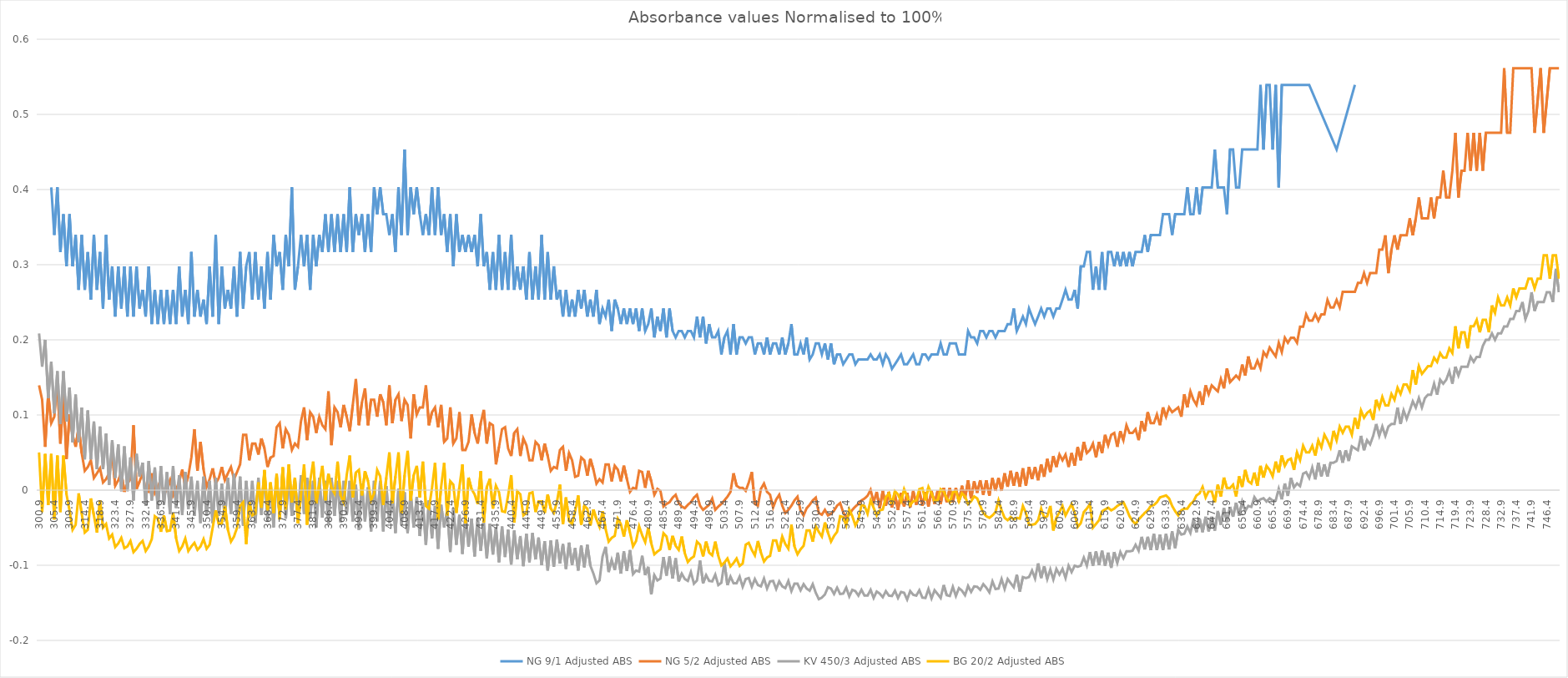
| Category | NG 9/1 | NG 5/2 | KV 450/3 | BG 20/2 |
|---|---|---|---|---|
| 300.90000000001135 | 0 | 0.139 | 0.209 | 0.05 |
| 301.8000000000113 | 0 | 0.12 | 0.164 | -0.029 |
| 302.7000000000113 | 0 | 0.058 | 0.2 | 0.048 |
| 303.6000000000113 | 0 | 0.128 | 0.123 | -0.02 |
| 304.50000000001125 | 0.403 | 0.089 | 0.171 | 0.048 |
| 305.40000000001123 | 0.34 | 0.098 | 0.102 | -0.039 |
| 306.3000000000112 | 0.403 | 0.144 | 0.158 | 0.046 |
| 307.2000000000112 | 0.317 | 0.062 | 0.088 | -0.029 |
| 308.10000000001116 | 0.367 | 0.128 | 0.158 | 0.046 |
| 309.00000000001114 | 0.298 | 0.042 | 0.091 | -0.006 |
| 309.9000000000111 | 0.367 | 0.101 | 0.137 | -0.027 |
| 310.8000000000111 | 0.298 | 0.074 | 0.064 | -0.053 |
| 311.7000000000111 | 0.34 | 0.058 | 0.127 | -0.046 |
| 312.60000000001105 | 0.267 | 0.084 | 0.064 | -0.004 |
| 313.500000000011 | 0.34 | 0.049 | 0.11 | -0.031 |
| 314.400000000011 | 0.267 | 0.026 | 0.041 | -0.056 |
| 315.300000000011 | 0.317 | 0.031 | 0.106 | -0.053 |
| 316.20000000001096 | 0.254 | 0.04 | 0.041 | -0.011 |
| 317.10000000001094 | 0.34 | 0.016 | 0.091 | -0.034 |
| 318.0000000000109 | 0.267 | 0.022 | 0.028 | -0.056 |
| 318.9000000000109 | 0.317 | 0.029 | 0.085 | -0.014 |
| 319.80000000001087 | 0.242 | 0.01 | 0.028 | -0.05 |
| 320.70000000001085 | 0.34 | 0.015 | 0.075 | -0.045 |
| 321.6000000000108 | 0.254 | 0.022 | 0.007 | -0.064 |
| 322.5000000000108 | 0.298 | 0.049 | 0.066 | -0.059 |
| 323.4000000000108 | 0.231 | 0.006 | 0.016 | -0.076 |
| 324.30000000001075 | 0.298 | 0.013 | 0.061 | -0.071 |
| 325.20000000001073 | 0.242 | 0.024 | -0.001 | -0.063 |
| 326.1000000000107 | 0.298 | -0.002 | 0.058 | -0.077 |
| 327.0000000000107 | 0.231 | 0.009 | -0.001 | -0.075 |
| 327.90000000001066 | 0.298 | 0.015 | 0.043 | -0.068 |
| 328.80000000001064 | 0.231 | 0.086 | -0.014 | -0.082 |
| 329.7000000000106 | 0.298 | 0.002 | 0.048 | -0.078 |
| 330.6000000000106 | 0.242 | 0.012 | 0.018 | -0.072 |
| 331.5000000000106 | 0.267 | 0.022 | 0.037 | -0.068 |
| 332.40000000001055 | 0.231 | -0.001 | -0.021 | -0.081 |
| 333.3000000000105 | 0.298 | -0.002 | 0.039 | -0.075 |
| 334.2000000000105 | 0.221 | 0.022 | -0.014 | -0.065 |
| 335.1000000000105 | 0.267 | -0.004 | 0.03 | -0.035 |
| 336.00000000001046 | 0.221 | 0.004 | -0.025 | -0.038 |
| 336.90000000001044 | 0.267 | 0.015 | 0.032 | -0.056 |
| 337.8000000000104 | 0.221 | -0.006 | -0.02 | -0.034 |
| 338.7000000000104 | 0.267 | 0.002 | 0.024 | -0.055 |
| 339.60000000001037 | 0.221 | 0.013 | -0.032 | -0.054 |
| 340.50000000001035 | 0.267 | -0.007 | 0.032 | -0.03 |
| 341.4000000000103 | 0.221 | 0 | -0.024 | -0.064 |
| 342.3000000000103 | 0.298 | 0.012 | 0.02 | -0.081 |
| 343.2000000000103 | 0.231 | 0.027 | -0.033 | -0.075 |
| 344.10000000001025 | 0.267 | 0.004 | 0.024 | -0.064 |
| 345.00000000001023 | 0.221 | 0.019 | -0.025 | -0.081 |
| 345.9000000000102 | 0.317 | 0.043 | 0.018 | -0.075 |
| 346.8000000000102 | 0.231 | 0.081 | -0.034 | -0.07 |
| 347.70000000001016 | 0.267 | 0.026 | 0.012 | -0.08 |
| 348.60000000001014 | 0.231 | 0.064 | -0.044 | -0.075 |
| 349.5000000000101 | 0.254 | 0.027 | 0.018 | -0.065 |
| 350.4000000000101 | 0.221 | 0.004 | -0.034 | -0.078 |
| 351.3000000000101 | 0.298 | 0.015 | 0.012 | -0.073 |
| 352.20000000001005 | 0.231 | 0.029 | -0.044 | -0.05 |
| 353.10000000001 | 0.34 | 0.009 | 0.016 | -0.027 |
| 354.00000000001 | 0.221 | 0.016 | -0.034 | -0.045 |
| 354.90000000001 | 0.298 | 0.031 | 0.009 | -0.044 |
| 355.80000000000996 | 0.242 | 0.013 | -0.039 | -0.021 |
| 356.70000000000994 | 0.267 | 0.022 | 0.016 | -0.053 |
| 357.6000000000099 | 0.242 | 0.031 | -0.032 | -0.069 |
| 358.5000000000099 | 0.298 | 0.015 | 0.022 | -0.062 |
| 359.40000000000987 | 0.231 | 0.024 | -0.039 | -0.05 |
| 360.30000000000985 | 0.317 | 0.034 | 0.018 | -0.021 |
| 361.2000000000098 | 0.242 | 0.074 | -0.047 | -0.016 |
| 362.1000000000098 | 0.298 | 0.074 | 0.012 | -0.072 |
| 363.0000000000098 | 0.317 | 0.04 | -0.037 | -0.016 |
| 363.90000000000975 | 0.254 | 0.062 | 0.012 | -0.034 |
| 364.80000000000973 | 0.317 | 0.062 | -0.044 | -0.031 |
| 365.7000000000097 | 0.254 | 0.047 | 0.016 | 0.01 |
| 366.6000000000097 | 0.298 | 0.069 | -0.033 | -0.023 |
| 367.50000000000966 | 0.242 | 0.055 | 0.024 | 0.027 |
| 368.40000000000964 | 0.317 | 0.031 | -0.041 | -0.027 |
| 369.3000000000096 | 0.254 | 0.043 | 0.009 | 0.01 |
| 370.2000000000096 | 0.34 | 0.045 | -0.049 | -0.03 |
| 371.1000000000096 | 0.298 | 0.084 | 0.018 | 0.022 |
| 372.00000000000955 | 0.317 | 0.089 | -0.035 | -0.039 |
| 372.9000000000095 | 0.267 | 0.055 | 0.028 | 0.03 |
| 373.8000000000095 | 0.34 | 0.081 | -0.038 | -0.026 |
| 374.7000000000095 | 0.298 | 0.074 | 0.018 | 0.034 |
| 375.60000000000946 | 0.403 | 0.053 | -0.034 | -0.016 |
| 376.50000000000944 | 0.267 | 0.062 | 0.014 | 0.017 |
| 377.4000000000094 | 0.298 | 0.058 | -0.038 | -0.044 |
| 378.3000000000094 | 0.34 | 0.092 | 0.02 | -0.006 |
| 379.20000000000937 | 0.298 | 0.11 | -0.032 | 0.034 |
| 380.10000000000935 | 0.34 | 0.066 | 0.016 | -0.046 |
| 381.0000000000093 | 0.267 | 0.104 | -0.038 | 0.012 |
| 381.9000000000093 | 0.34 | 0.098 | 0.012 | 0.038 |
| 382.8000000000093 | 0.298 | 0.076 | -0.049 | -0.017 |
| 383.70000000000925 | 0.34 | 0.098 | 0.016 | 0.007 |
| 384.60000000000923 | 0.317 | 0.086 | -0.037 | 0.032 |
| 385.5000000000092 | 0.367 | 0.081 | 0.012 | -0.014 |
| 386.4000000000092 | 0.317 | 0.131 | -0.045 | 0.022 |
| 387.30000000000916 | 0.367 | 0.06 | 0.016 | 0.003 |
| 388.20000000000914 | 0.317 | 0.11 | -0.034 | -0.004 |
| 389.1000000000091 | 0.367 | 0.104 | 0.012 | 0.038 |
| 390.0000000000091 | 0.317 | 0.084 | -0.043 | -0.007 |
| 390.9000000000091 | 0.367 | 0.113 | 0.012 | -0.016 |
| 391.80000000000905 | 0.317 | 0.098 | -0.033 | 0.02 |
| 392.700000000009 | 0.403 | 0.079 | 0.012 | 0.046 |
| 393.600000000009 | 0.317 | 0.113 | -0.041 | -0.01 |
| 394.500000000009 | 0.367 | 0.148 | 0.007 | 0.023 |
| 395.40000000000896 | 0.34 | 0.086 | -0.053 | 0.027 |
| 396.30000000000894 | 0.367 | 0.117 | 0.009 | -0.007 |
| 397.2000000000089 | 0.317 | 0.135 | -0.041 | 0.025 |
| 398.1000000000089 | 0.367 | 0.086 | 0.004 | 0.012 |
| 399.00000000000887 | 0.317 | 0.12 | -0.055 | -0.014 |
| 399.90000000000884 | 0.403 | 0.12 | 0.012 | -0.004 |
| 400.8000000000088 | 0.367 | 0.098 | -0.041 | 0.027 |
| 401.7000000000088 | 0.403 | 0.128 | 0.012 | 0.018 |
| 402.6000000000088 | 0.367 | 0.117 | -0.055 | -0.02 |
| 403.50000000000875 | 0.367 | 0.086 | 0.005 | 0.017 |
| 404.40000000000873 | 0.34 | 0.139 | -0.044 | 0.05 |
| 405.3000000000087 | 0.367 | 0.089 | -0.001 | -0.017 |
| 406.2000000000087 | 0.317 | 0.12 | -0.057 | 0.018 |
| 407.10000000000866 | 0.403 | 0.128 | 0.002 | 0.05 |
| 408.00000000000864 | 0.34 | 0.092 | -0.046 | -0.03 |
| 408.9000000000086 | 0.453 | 0.12 | -0.003 | 0.02 |
| 409.8000000000086 | 0.34 | 0.113 | -0.057 | 0.052 |
| 410.7000000000086 | 0.403 | 0.069 | -0.003 | -0.014 |
| 411.60000000000855 | 0.367 | 0.128 | -0.049 | 0.02 |
| 412.5000000000085 | 0.403 | 0.101 | -0.009 | 0.032 |
| 413.4000000000085 | 0.367 | 0.11 | -0.061 | -0.01 |
| 414.3000000000085 | 0.34 | 0.11 | -0.017 | 0.038 |
| 415.20000000000846 | 0.367 | 0.139 | -0.073 | -0.021 |
| 416.10000000000844 | 0.34 | 0.086 | -0.014 | -0.025 |
| 417.0000000000084 | 0.403 | 0.104 | -0.064 | 0.003 |
| 417.9000000000084 | 0.34 | 0.11 | -0.021 | 0.036 |
| 418.80000000000837 | 0.403 | 0.084 | -0.078 | -0.039 |
| 419.70000000000834 | 0.34 | 0.113 | -0.02 | 0.004 |
| 420.6000000000083 | 0.367 | 0.064 | -0.049 | 0.036 |
| 421.5000000000083 | 0.317 | 0.069 | -0.026 | -0.034 |
| 422.4000000000083 | 0.367 | 0.11 | -0.082 | 0.012 |
| 423.30000000000825 | 0.298 | 0.062 | -0.024 | 0.007 |
| 424.20000000000823 | 0.367 | 0.069 | -0.073 | -0.03 |
| 425.1000000000082 | 0.317 | 0.104 | -0.033 | 0.004 |
| 426.0000000000082 | 0.34 | 0.053 | -0.085 | 0.034 |
| 426.90000000000816 | 0.317 | 0.053 | -0.032 | -0.044 |
| 427.80000000000814 | 0.34 | 0.064 | -0.075 | 0.017 |
| 428.7000000000081 | 0.317 | 0.101 | -0.038 | 0.001 |
| 429.6000000000081 | 0.34 | 0.076 | -0.088 | -0.006 |
| 430.5000000000081 | 0.298 | 0.062 | -0.037 | -0.019 |
| 431.40000000000805 | 0.367 | 0.089 | -0.081 | 0.025 |
| 432.300000000008 | 0.298 | 0.107 | -0.044 | -0.043 |
| 433.200000000008 | 0.317 | 0.062 | -0.091 | 0.004 |
| 434.100000000008 | 0.267 | 0.089 | -0.045 | 0.015 |
| 435.00000000000796 | 0.317 | 0.086 | -0.086 | -0.025 |
| 435.90000000000794 | 0.267 | 0.034 | -0.049 | 0.006 |
| 436.8000000000079 | 0.34 | 0.058 | -0.096 | -0.003 |
| 437.7000000000079 | 0.267 | 0.081 | -0.048 | -0.028 |
| 438.60000000000787 | 0.317 | 0.084 | -0.089 | -0.029 |
| 439.50000000000784 | 0.267 | 0.055 | -0.053 | -0.007 |
| 440.4000000000078 | 0.34 | 0.045 | -0.099 | 0.02 |
| 441.3000000000078 | 0.267 | 0.076 | -0.054 | -0.043 |
| 442.2000000000078 | 0.298 | 0.081 | -0.092 | -0.002 |
| 443.10000000000775 | 0.267 | 0.045 | -0.061 | -0.006 |
| 444.00000000000773 | 0.298 | 0.069 | -0.101 | -0.034 |
| 444.9000000000077 | 0.254 | 0.06 | -0.058 | -0.03 |
| 445.8000000000077 | 0.317 | 0.04 | -0.096 | -0.004 |
| 446.70000000000766 | 0.254 | 0.04 | -0.057 | -0.003 |
| 447.60000000000764 | 0.298 | 0.064 | -0.092 | -0.029 |
| 448.5000000000076 | 0.254 | 0.06 | -0.063 | -0.015 |
| 449.4000000000076 | 0.34 | 0.04 | -0.1 | -0.015 |
| 450.30000000000757 | 0.254 | 0.062 | -0.068 | -0.03 |
| 451.20000000000755 | 0.317 | 0.045 | -0.107 | -0.006 |
| 452.1000000000075 | 0.254 | 0.026 | -0.067 | -0.025 |
| 453.0000000000075 | 0.298 | 0.031 | -0.102 | -0.03 |
| 453.9000000000075 | 0.254 | 0.029 | -0.066 | -0.016 |
| 454.80000000000746 | 0.267 | 0.053 | -0.098 | 0.007 |
| 455.70000000000744 | 0.231 | 0.058 | -0.072 | -0.045 |
| 456.6000000000074 | 0.267 | 0.026 | -0.105 | -0.01 |
| 457.5000000000074 | 0.231 | 0.049 | -0.07 | -0.041 |
| 458.40000000000737 | 0.254 | 0.04 | -0.1 | -0.045 |
| 459.30000000000734 | 0.231 | 0.018 | -0.077 | -0.028 |
| 460.2000000000073 | 0.267 | 0.019 | -0.107 | -0.007 |
| 461.1000000000073 | 0.242 | 0.043 | -0.074 | -0.046 |
| 462.0000000000073 | 0.267 | 0.04 | -0.103 | -0.021 |
| 462.90000000000725 | 0.231 | 0.019 | -0.073 | -0.025 |
| 463.80000000000723 | 0.254 | 0.042 | -0.101 | -0.047 |
| 464.7000000000072 | 0.231 | 0.027 | -0.111 | -0.026 |
| 465.6000000000072 | 0.267 | 0.009 | -0.124 | -0.039 |
| 466.50000000000716 | 0.221 | 0.015 | -0.12 | -0.049 |
| 467.40000000000714 | 0.242 | 0.01 | -0.088 | -0.028 |
| 468.3000000000071 | 0.231 | 0.034 | -0.075 | -0.052 |
| 469.2000000000071 | 0.254 | 0.034 | -0.109 | -0.069 |
| 470.10000000000707 | 0.212 | 0.012 | -0.093 | -0.063 |
| 471.00000000000705 | 0.254 | 0.033 | -0.106 | -0.061 |
| 471.900000000007 | 0.242 | 0.027 | -0.083 | -0.038 |
| 472.800000000007 | 0.221 | 0.012 | -0.111 | -0.045 |
| 473.700000000007 | 0.242 | 0.033 | -0.082 | -0.062 |
| 474.60000000000696 | 0.221 | 0.015 | -0.108 | -0.04 |
| 475.50000000000693 | 0.242 | -0.002 | -0.08 | -0.056 |
| 476.4000000000069 | 0.221 | 0.003 | -0.112 | -0.075 |
| 477.3000000000069 | 0.242 | 0.002 | -0.107 | -0.068 |
| 478.20000000000687 | 0.212 | 0.026 | -0.108 | -0.048 |
| 479.10000000000684 | 0.242 | 0.024 | -0.087 | -0.06 |
| 480.0000000000068 | 0.212 | 0.003 | -0.113 | -0.069 |
| 480.9000000000068 | 0.221 | 0.026 | -0.102 | -0.05 |
| 481.8000000000068 | 0.242 | 0.012 | -0.139 | -0.071 |
| 482.70000000000675 | 0.203 | -0.006 | -0.113 | -0.085 |
| 483.60000000000673 | 0.231 | 0.002 | -0.12 | -0.082 |
| 484.5000000000067 | 0.212 | -0.001 | -0.118 | -0.079 |
| 485.4000000000067 | 0.242 | -0.022 | -0.089 | -0.057 |
| 486.30000000000666 | 0.203 | -0.018 | -0.114 | -0.062 |
| 487.20000000000664 | 0.242 | -0.016 | -0.088 | -0.08 |
| 488.1000000000066 | 0.212 | -0.01 | -0.118 | -0.061 |
| 489.0000000000066 | 0.203 | -0.006 | -0.091 | -0.074 |
| 489.90000000000657 | 0.212 | -0.017 | -0.121 | -0.08 |
| 490.80000000000655 | 0.212 | -0.022 | -0.111 | -0.062 |
| 491.7000000000065 | 0.203 | -0.024 | -0.118 | -0.084 |
| 492.6000000000065 | 0.212 | -0.02 | -0.121 | -0.096 |
| 493.5000000000065 | 0.212 | -0.016 | -0.109 | -0.091 |
| 494.40000000000646 | 0.203 | -0.01 | -0.124 | -0.088 |
| 495.30000000000643 | 0.231 | -0.006 | -0.12 | -0.069 |
| 496.2000000000064 | 0.203 | -0.021 | -0.094 | -0.073 |
| 497.1000000000064 | 0.231 | -0.026 | -0.124 | -0.088 |
| 498.00000000000637 | 0.195 | -0.023 | -0.113 | -0.069 |
| 498.90000000000634 | 0.221 | -0.02 | -0.121 | -0.083 |
| 499.8000000000063 | 0.203 | -0.011 | -0.121 | -0.087 |
| 500.7000000000063 | 0.203 | -0.026 | -0.112 | -0.069 |
| 501.6000000000063 | 0.212 | -0.022 | -0.126 | -0.088 |
| 502.50000000000625 | 0.181 | -0.018 | -0.123 | -0.1 |
| 503.40000000000623 | 0.203 | -0.014 | -0.096 | -0.096 |
| 504.3000000000062 | 0.212 | -0.009 | -0.126 | -0.091 |
| 505.2000000000062 | 0.181 | -0.002 | -0.115 | -0.102 |
| 506.10000000000616 | 0.221 | 0.022 | -0.124 | -0.097 |
| 507.00000000000614 | 0.181 | 0.006 | -0.124 | -0.091 |
| 507.9000000000061 | 0.203 | 0.003 | -0.115 | -0.101 |
| 508.8000000000061 | 0.203 | 0.003 | -0.129 | -0.098 |
| 509.70000000000607 | 0.195 | -0.001 | -0.118 | -0.073 |
| 510.60000000000605 | 0.203 | 0.01 | -0.117 | -0.07 |
| 511.500000000006 | 0.203 | 0.024 | -0.129 | -0.08 |
| 512.400000000006 | 0.181 | -0.018 | -0.118 | -0.087 |
| 513.300000000006 | 0.195 | -0.021 | -0.126 | -0.068 |
| 514.200000000006 | 0.195 | 0.002 | -0.128 | -0.083 |
| 515.1000000000059 | 0.181 | 0.009 | -0.118 | -0.095 |
| 516.0000000000059 | 0.203 | -0.002 | -0.131 | -0.09 |
| 516.9000000000059 | 0.181 | -0.006 | -0.121 | -0.088 |
| 517.8000000000059 | 0.195 | -0.023 | -0.121 | -0.067 |
| 518.7000000000058 | 0.195 | -0.012 | -0.132 | -0.067 |
| 519.6000000000058 | 0.181 | -0.006 | -0.121 | -0.082 |
| 520.5000000000058 | 0.203 | -0.021 | -0.128 | -0.062 |
| 521.4000000000058 | 0.181 | -0.031 | -0.13 | -0.072 |
| 522.3000000000058 | 0.195 | -0.026 | -0.121 | -0.078 |
| 523.2000000000057 | 0.221 | -0.021 | -0.134 | -0.046 |
| 524.1000000000057 | 0.181 | -0.014 | -0.124 | -0.075 |
| 525.0000000000057 | 0.181 | -0.009 | -0.124 | -0.085 |
| 525.9000000000057 | 0.195 | -0.027 | -0.133 | -0.079 |
| 526.8000000000056 | 0.181 | -0.034 | -0.125 | -0.074 |
| 527.7000000000056 | 0.203 | -0.024 | -0.131 | -0.054 |
| 528.6000000000056 | 0.174 | -0.02 | -0.134 | -0.054 |
| 529.5000000000056 | 0.181 | -0.014 | -0.125 | -0.069 |
| 530.4000000000055 | 0.195 | -0.01 | -0.137 | -0.048 |
| 531.3000000000055 | 0.195 | -0.031 | -0.145 | -0.056 |
| 532.2000000000055 | 0.181 | -0.033 | -0.143 | -0.062 |
| 533.1000000000055 | 0.195 | -0.026 | -0.139 | -0.043 |
| 534.0000000000055 | 0.174 | -0.034 | -0.129 | -0.056 |
| 534.9000000000054 | 0.195 | -0.032 | -0.131 | -0.069 |
| 535.8000000000054 | 0.168 | -0.027 | -0.138 | -0.061 |
| 536.7000000000054 | 0.181 | -0.021 | -0.13 | -0.056 |
| 537.6000000000054 | 0.181 | -0.017 | -0.138 | -0.035 |
| 538.5000000000053 | 0.168 | -0.029 | -0.138 | -0.036 |
| 539.4000000000053 | 0.174 | -0.036 | -0.13 | -0.047 |
| 540.3000000000053 | 0.181 | -0.033 | -0.141 | -0.026 |
| 541.2000000000053 | 0.181 | -0.026 | -0.133 | -0.035 |
| 542.1000000000053 | 0.168 | -0.022 | -0.134 | -0.047 |
| 543.0000000000052 | 0.174 | -0.018 | -0.14 | -0.039 |
| 543.9000000000052 | 0.174 | -0.014 | -0.133 | -0.02 |
| 544.8000000000052 | 0.174 | -0.011 | -0.14 | -0.021 |
| 545.7000000000052 | 0.174 | -0.007 | -0.14 | -0.031 |
| 546.6000000000051 | 0.181 | 0 | -0.133 | -0.014 |
| 547.5000000000051 | 0.174 | -0.016 | -0.144 | -0.023 |
| 548.4000000000051 | 0.174 | -0.002 | -0.135 | -0.034 |
| 549.3000000000051 | 0.181 | -0.024 | -0.138 | -0.027 |
| 550.200000000005 | 0.168 | -0.001 | -0.142 | -0.026 |
| 551.100000000005 | 0.181 | -0.021 | -0.134 | -0.01 |
| 552.000000000005 | 0.174 | -0.002 | -0.14 | -0.004 |
| 552.900000000005 | 0.161 | -0.023 | -0.141 | -0.019 |
| 553.800000000005 | 0.168 | -0.006 | -0.134 | -0.002 |
| 554.7000000000049 | 0.174 | -0.026 | -0.144 | -0.006 |
| 555.6000000000049 | 0.181 | -0.004 | -0.135 | -0.015 |
| 556.5000000000049 | 0.168 | -0.022 | -0.137 | 0.001 |
| 557.4000000000049 | 0.168 | -0.004 | -0.146 | -0.008 |
| 558.3000000000048 | 0.174 | -0.023 | -0.134 | -0.02 |
| 559.2000000000048 | 0.181 | -0.001 | -0.139 | -0.015 |
| 560.1000000000048 | 0.168 | -0.02 | -0.14 | -0.014 |
| 561.0000000000048 | 0.168 | -0.001 | -0.133 | 0.001 |
| 561.9000000000048 | 0.181 | -0.021 | -0.143 | 0.003 |
| 562.8000000000047 | 0.181 | -0.002 | -0.144 | -0.014 |
| 563.7000000000047 | 0.174 | -0.022 | -0.132 | 0.004 |
| 564.6000000000047 | 0.181 | -0.001 | -0.144 | -0.004 |
| 565.5000000000047 | 0.181 | -0.018 | -0.133 | -0.015 |
| 566.4000000000046 | 0.181 | -0.001 | -0.138 | -0.014 |
| 567.3000000000046 | 0.195 | -0.018 | -0.144 | 0.001 |
| 568.2000000000046 | 0.181 | 0.003 | -0.126 | -0.002 |
| 569.1000000000046 | 0.181 | -0.016 | -0.14 | -0.011 |
| 570.0000000000045 | 0.195 | 0.003 | -0.141 | -0.016 |
| 570.9000000000045 | 0.195 | -0.016 | -0.129 | -0.003 |
| 571.8000000000045 | 0.195 | 0.003 | -0.141 | -0.002 |
| 572.7000000000045 | 0.181 | -0.016 | -0.13 | -0.015 |
| 573.6000000000045 | 0.181 | 0.006 | -0.134 | -0.004 |
| 574.5000000000044 | 0.181 | -0.011 | -0.14 | -0.008 |
| 575.4000000000044 | 0.212 | 0.013 | -0.127 | -0.019 |
| 576.3000000000044 | 0.203 | -0.011 | -0.135 | -0.015 |
| 577.2000000000044 | 0.203 | 0.012 | -0.128 | -0.008 |
| 578.1000000000043 | 0.195 | -0.004 | -0.129 | -0.011 |
| 579.0000000000043 | 0.212 | 0.013 | -0.133 | -0.021 |
| 579.9000000000043 | 0.212 | -0.006 | -0.125 | -0.03 |
| 580.8000000000043 | 0.203 | 0.013 | -0.13 | -0.035 |
| 581.7000000000043 | 0.212 | -0.007 | -0.136 | -0.037 |
| 582.6000000000042 | 0.212 | 0.016 | -0.121 | -0.034 |
| 583.5000000000042 | 0.203 | -0.001 | -0.132 | -0.029 |
| 584.4000000000042 | 0.212 | 0.016 | -0.131 | -0.014 |
| 585.3000000000042 | 0.212 | -0.001 | -0.118 | -0.027 |
| 586.2000000000041 | 0.212 | 0.022 | -0.132 | -0.037 |
| 587.1000000000041 | 0.221 | 0.004 | -0.118 | -0.04 |
| 588.0000000000041 | 0.221 | 0.026 | -0.124 | -0.036 |
| 588.9000000000041 | 0.242 | 0.006 | -0.129 | -0.039 |
| 589.800000000004 | 0.212 | 0.024 | -0.112 | -0.037 |
| 590.700000000004 | 0.221 | 0.004 | -0.135 | -0.038 |
| 591.600000000004 | 0.231 | 0.029 | -0.116 | -0.021 |
| 592.500000000004 | 0.221 | 0.006 | -0.117 | -0.03 |
| 593.400000000004 | 0.242 | 0.031 | -0.116 | -0.046 |
| 594.3000000000039 | 0.231 | 0.015 | -0.107 | -0.046 |
| 595.2000000000039 | 0.221 | 0.031 | -0.118 | -0.045 |
| 596.1000000000039 | 0.231 | 0.013 | -0.098 | -0.04 |
| 597.0000000000039 | 0.242 | 0.034 | -0.117 | -0.025 |
| 597.9000000000038 | 0.231 | 0.018 | -0.101 | -0.037 |
| 598.8000000000038 | 0.242 | 0.042 | -0.118 | -0.035 |
| 599.7000000000038 | 0.242 | 0.024 | -0.106 | -0.021 |
| 600.6000000000038 | 0.231 | 0.045 | -0.119 | -0.054 |
| 601.5000000000038 | 0.242 | 0.031 | -0.105 | -0.037 |
| 602.4000000000037 | 0.242 | 0.047 | -0.112 | -0.029 |
| 603.3000000000037 | 0.254 | 0.04 | -0.105 | -0.021 |
| 604.2000000000037 | 0.267 | 0.047 | -0.117 | -0.034 |
| 605.1000000000037 | 0.254 | 0.031 | -0.101 | -0.026 |
| 606.0000000000036 | 0.254 | 0.049 | -0.109 | -0.019 |
| 606.9000000000036 | 0.267 | 0.033 | -0.101 | -0.03 |
| 607.8000000000036 | 0.242 | 0.058 | -0.102 | -0.049 |
| 608.7000000000036 | 0.298 | 0.04 | -0.101 | -0.044 |
| 609.6000000000035 | 0.298 | 0.064 | -0.09 | -0.029 |
| 610.5000000000035 | 0.317 | 0.049 | -0.101 | -0.025 |
| 611.4000000000035 | 0.317 | 0.053 | -0.082 | -0.019 |
| 612.3000000000035 | 0.267 | 0.062 | -0.101 | -0.05 |
| 613.2000000000035 | 0.298 | 0.043 | -0.082 | -0.045 |
| 614.1000000000034 | 0.267 | 0.064 | -0.1 | -0.04 |
| 615.0000000000034 | 0.317 | 0.049 | -0.081 | -0.028 |
| 615.9000000000034 | 0.267 | 0.074 | -0.101 | -0.026 |
| 616.8000000000034 | 0.317 | 0.06 | -0.083 | -0.023 |
| 617.7000000000033 | 0.317 | 0.074 | -0.103 | -0.027 |
| 618.6000000000033 | 0.298 | 0.076 | -0.082 | -0.025 |
| 619.5000000000033 | 0.317 | 0.058 | -0.097 | -0.021 |
| 620.4000000000033 | 0.298 | 0.079 | -0.082 | -0.019 |
| 621.3000000000033 | 0.317 | 0.066 | -0.091 | -0.016 |
| 622.2000000000032 | 0.298 | 0.086 | -0.082 | -0.025 |
| 623.1000000000032 | 0.317 | 0.076 | -0.082 | -0.035 |
| 624.0000000000032 | 0.298 | 0.076 | -0.081 | -0.041 |
| 624.9000000000032 | 0.317 | 0.081 | -0.073 | -0.045 |
| 625.8000000000031 | 0.317 | 0.066 | -0.081 | -0.039 |
| 626.7000000000031 | 0.317 | 0.092 | -0.062 | -0.035 |
| 627.6000000000031 | 0.34 | 0.079 | -0.079 | -0.03 |
| 628.5000000000031 | 0.317 | 0.104 | -0.062 | -0.027 |
| 629.400000000003 | 0.34 | 0.089 | -0.08 | -0.021 |
| 630.300000000003 | 0.34 | 0.089 | -0.058 | -0.02 |
| 631.200000000003 | 0.34 | 0.101 | -0.08 | -0.016 |
| 632.100000000003 | 0.34 | 0.086 | -0.059 | -0.01 |
| 633.000000000003 | 0.367 | 0.11 | -0.08 | -0.008 |
| 633.9000000000029 | 0.367 | 0.098 | -0.058 | -0.007 |
| 634.8000000000029 | 0.367 | 0.11 | -0.079 | -0.011 |
| 635.7000000000029 | 0.34 | 0.104 | -0.055 | -0.021 |
| 636.6000000000029 | 0.367 | 0.107 | -0.077 | -0.028 |
| 637.5000000000028 | 0.367 | 0.11 | -0.053 | -0.034 |
| 638.4000000000028 | 0.367 | 0.098 | -0.059 | -0.027 |
| 639.3000000000028 | 0.367 | 0.128 | -0.058 | -0.025 |
| 640.2000000000028 | 0.403 | 0.11 | -0.048 | -0.025 |
| 641.1000000000028 | 0.367 | 0.131 | -0.057 | -0.019 |
| 642.0000000000027 | 0.367 | 0.12 | -0.039 | -0.015 |
| 642.9000000000027 | 0.403 | 0.113 | -0.056 | -0.007 |
| 643.8000000000027 | 0.367 | 0.131 | -0.038 | -0.004 |
| 644.7000000000027 | 0.403 | 0.113 | -0.056 | 0.004 |
| 645.6000000000026 | 0.403 | 0.139 | -0.035 | -0.01 |
| 646.5000000000026 | 0.403 | 0.128 | -0.055 | -0.002 |
| 647.4000000000026 | 0.403 | 0.139 | -0.035 | -0.002 |
| 648.3000000000026 | 0.453 | 0.135 | -0.054 | -0.016 |
| 649.2000000000025 | 0.403 | 0.131 | -0.028 | 0.007 |
| 650.1000000000025 | 0.403 | 0.148 | -0.046 | -0.008 |
| 651.0000000000025 | 0.403 | 0.135 | -0.024 | 0.017 |
| 651.9000000000025 | 0.367 | 0.162 | -0.043 | 0.003 |
| 652.8000000000025 | 0.453 | 0.144 | -0.022 | 0.003 |
| 653.7000000000024 | 0.453 | 0.148 | -0.035 | 0.007 |
| 654.6000000000024 | 0.403 | 0.152 | -0.017 | -0.008 |
| 655.5000000000024 | 0.403 | 0.148 | -0.034 | 0.018 |
| 656.4000000000024 | 0.453 | 0.167 | -0.015 | 0.004 |
| 657.3000000000023 | 0.453 | 0.152 | -0.028 | 0.027 |
| 658.2000000000023 | 0 | 0.178 | -0.021 | 0.012 |
| 659.1000000000023 | 0.453 | 0.162 | -0.022 | 0.009 |
| 660.0000000000023 | 0.453 | 0.162 | -0.009 | 0.023 |
| 660.9000000000023 | 0.453 | 0.172 | -0.015 | 0.006 |
| 661.8000000000022 | 0.539 | 0.162 | -0.012 | 0.032 |
| 662.7000000000022 | 0.453 | 0.184 | -0.011 | 0.017 |
| 663.6000000000022 | 0.539 | 0.178 | -0.015 | 0.032 |
| 664.5000000000022 | 0.539 | 0.19 | -0.011 | 0.027 |
| 665.4000000000021 | 0.453 | 0.184 | -0.014 | 0.018 |
| 666.3000000000021 | 0.539 | 0.178 | -0.014 | 0.038 |
| 667.2000000000021 | 0.403 | 0.196 | 0.002 | 0.023 |
| 668.1000000000021 | 0.539 | 0.184 | -0.012 | 0.046 |
| 669.000000000002 | 0.539 | 0.203 | 0.009 | 0.032 |
| 669.900000000002 | 0.539 | 0.196 | -0.008 | 0.04 |
| 670.800000000002 | 0.539 | 0.203 | 0.016 | 0.042 |
| 671.700000000002 | 0.539 | 0.203 | 0.004 | 0.027 |
| 672.600000000002 | 0.539 | 0.196 | 0.009 | 0.05 |
| 673.5000000000019 | 0.539 | 0.217 | 0.005 | 0.04 |
| 674.4000000000019 | 0.539 | 0.217 | 0.022 | 0.059 |
| 675.3000000000019 | 0.539 | 0.234 | 0.024 | 0.05 |
| 676.2000000000019 | 0.539 | 0.225 | 0.016 | 0.05 |
| 677.1000000000018 | 0 | 0.225 | 0.03 | 0.059 |
| 678.0000000000018 | 0 | 0.234 | 0.014 | 0.046 |
| 678.9000000000018 | 0 | 0.225 | 0.037 | 0.066 |
| 679.8000000000018 | 0 | 0.234 | 0.018 | 0.057 |
| 680.7000000000018 | 0 | 0.234 | 0.034 | 0.074 |
| 681.6000000000017 | 0 | 0.253 | 0.018 | 0.066 |
| 682.5000000000017 | 0 | 0.243 | 0.037 | 0.057 |
| 683.4000000000017 | 0 | 0.243 | 0.037 | 0.079 |
| 684.3000000000017 | 0.453 | 0.253 | 0.039 | 0.066 |
| 685.2000000000016 | 0 | 0.243 | 0.053 | 0.084 |
| 686.1000000000016 | 0 | 0.264 | 0.037 | 0.076 |
| 687.0000000000016 | 0 | 0.264 | 0.053 | 0.084 |
| 687.9000000000016 | 0 | 0.264 | 0.039 | 0.084 |
| 688.8000000000015 | 0 | 0.264 | 0.058 | 0.074 |
| 689.7000000000015 | 0.539 | 0.264 | 0.056 | 0.096 |
| 690.6000000000015 | 0 | 0.276 | 0.053 | 0.082 |
| 691.5000000000015 | 0 | 0.276 | 0.072 | 0.106 |
| 692.4000000000015 | 0 | 0.289 | 0.053 | 0.096 |
| 693.3000000000014 | 0 | 0.276 | 0.066 | 0.103 |
| 694.2000000000014 | 0 | 0.289 | 0.061 | 0.106 |
| 695.1000000000014 | 0 | 0.289 | 0.072 | 0.093 |
| 696.0000000000014 | 0 | 0.289 | 0.088 | 0.12 |
| 696.9000000000013 | 0 | 0.32 | 0.072 | 0.109 |
| 697.8000000000013 | 0 | 0.32 | 0.085 | 0.124 |
| 698.7000000000013 | 0 | 0.339 | 0.072 | 0.113 |
| 699.6000000000013 | 0 | 0.289 | 0.085 | 0.113 |
| 700.5000000000013 | 0 | 0.32 | 0.088 | 0.128 |
| 701.4000000000012 | 0 | 0.339 | 0.088 | 0.12 |
| 702.3000000000012 | 0 | 0.32 | 0.11 | 0.136 |
| 703.2000000000012 | 0 | 0.339 | 0.088 | 0.128 |
| 704.1000000000012 | 0 | 0.339 | 0.106 | 0.141 |
| 705.0000000000011 | 0 | 0.339 | 0.095 | 0.141 |
| 705.9000000000011 | 0 | 0.362 | 0.106 | 0.132 |
| 706.8000000000011 | 0 | 0.339 | 0.118 | 0.16 |
| 707.7000000000011 | 0 | 0.362 | 0.11 | 0.141 |
| 708.600000000001 | 0 | 0.389 | 0.123 | 0.165 |
| 709.500000000001 | 0 | 0.362 | 0.11 | 0.155 |
| 710.400000000001 | 0 | 0.362 | 0.123 | 0.16 |
| 711.300000000001 | 0 | 0.362 | 0.127 | 0.165 |
| 712.200000000001 | 0 | 0.389 | 0.127 | 0.165 |
| 713.1000000000009 | 0 | 0.362 | 0.142 | 0.176 |
| 714.0000000000009 | 0 | 0.389 | 0.127 | 0.171 |
| 714.9000000000009 | 0 | 0.389 | 0.147 | 0.182 |
| 715.8000000000009 | 0 | 0.425 | 0.142 | 0.176 |
| 716.7000000000008 | 0 | 0.389 | 0.147 | 0.176 |
| 717.6000000000008 | 0 | 0.389 | 0.158 | 0.189 |
| 718.5000000000008 | 0 | 0.425 | 0.142 | 0.182 |
| 719.4000000000008 | 0 | 0.475 | 0.164 | 0.218 |
| 720.3000000000008 | 0 | 0.389 | 0.152 | 0.189 |
| 721.2000000000007 | 0 | 0.425 | 0.164 | 0.21 |
| 722.1000000000007 | 0 | 0.425 | 0.164 | 0.21 |
| 723.0000000000007 | 0 | 0.475 | 0.164 | 0.189 |
| 723.9000000000007 | 0 | 0.425 | 0.177 | 0.218 |
| 724.8000000000006 | 0 | 0.475 | 0.171 | 0.218 |
| 725.7000000000006 | 0 | 0.425 | 0.177 | 0.227 |
| 726.6000000000006 | 0 | 0.475 | 0.177 | 0.21 |
| 727.5000000000006 | 0 | 0.425 | 0.192 | 0.227 |
| 728.4000000000005 | 0 | 0.475 | 0.2 | 0.227 |
| 729.3000000000005 | 0 | 0.475 | 0.2 | 0.21 |
| 730.2000000000005 | 0 | 0.475 | 0.209 | 0.246 |
| 731.1000000000005 | 0 | 0.475 | 0.2 | 0.236 |
| 732.0000000000005 | 0 | 0.475 | 0.209 | 0.257 |
| 732.9000000000004 | 0 | 0.475 | 0.209 | 0.246 |
| 733.8000000000004 | 0 | 0.561 | 0.218 | 0.246 |
| 734.7000000000004 | 0 | 0.475 | 0.218 | 0.257 |
| 735.6000000000004 | 0 | 0.475 | 0.228 | 0.246 |
| 736.5000000000003 | 0 | 0.561 | 0.228 | 0.268 |
| 737.4000000000003 | 0 | 0.561 | 0.238 | 0.257 |
| 738.3000000000003 | 0 | 0.561 | 0.238 | 0.268 |
| 739.2000000000003 | 0 | 0.561 | 0.25 | 0.268 |
| 740.1000000000003 | 0 | 0.561 | 0.228 | 0.268 |
| 741.0000000000002 | 0 | 0.561 | 0.238 | 0.281 |
| 741.9000000000002 | 0 | 0.561 | 0.263 | 0.281 |
| 742.8000000000002 | 0 | 0.475 | 0.238 | 0.268 |
| 743.7000000000002 | 0 | 0 | 0.25 | 0.281 |
| 744.6000000000001 | 0 | 0.561 | 0.25 | 0.281 |
| 745.5000000000001 | 0 | 0.475 | 0.25 | 0.313 |
| 746.4000000000001 | 0 | 0 | 0.263 | 0.313 |
| 747.3000000000001 | 0 | 0.561 | 0.263 | 0.281 |
| 748.2 | 0 | 0.561 | 0.25 | 0.313 |
| 749.1 | 0 | 0 | 0.295 | 0.313 |
| 750.0 | 0 | 0.561 | 0.263 | 0.281 |